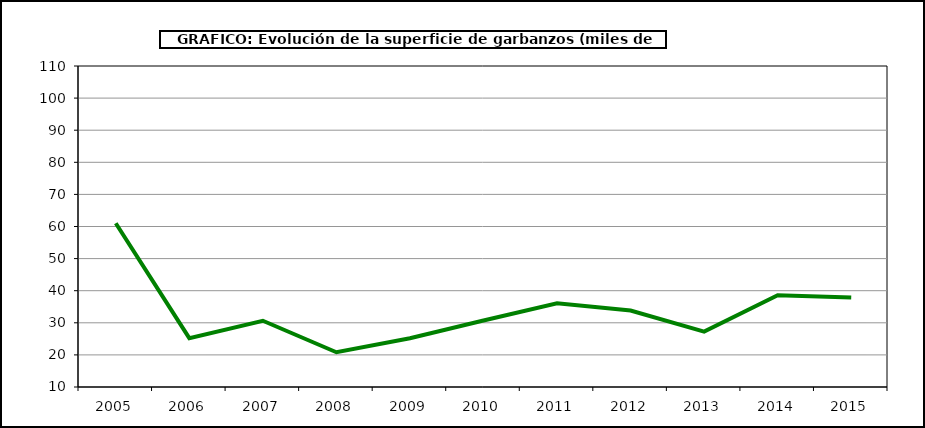
| Category | Superficie |
|---|---|
| 2005.0 | 61.015 |
| 2006.0 | 25.205 |
| 2007.0 | 30.633 |
| 2008.0 | 20.832 |
| 2009.0 | 25.195 |
| 2010.0 | 30.725 |
| 2011.0 | 36.097 |
| 2012.0 | 33.84 |
| 2013.0 | 27.252 |
| 2014.0 | 38.61 |
| 2015.0 | 37.869 |